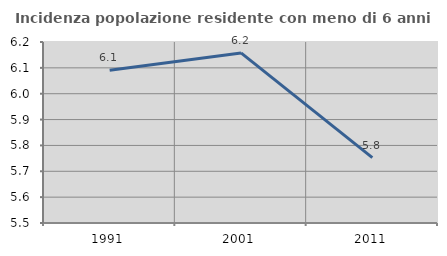
| Category | Incidenza popolazione residente con meno di 6 anni |
|---|---|
| 1991.0 | 6.09 |
| 2001.0 | 6.158 |
| 2011.0 | 5.753 |